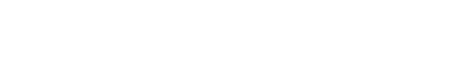
| Category | Series 1 | Series 0 | Series 2 |
|---|---|---|---|
| 0 | 0 | 0 | 0 |